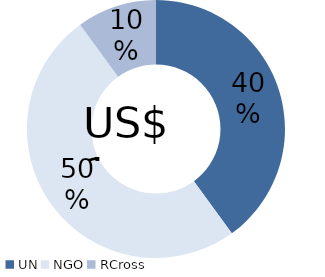
| Category | Series 0 |
|---|---|
| UN | 0.4 |
| NGO | 0.5 |
| RCross | 0.1 |